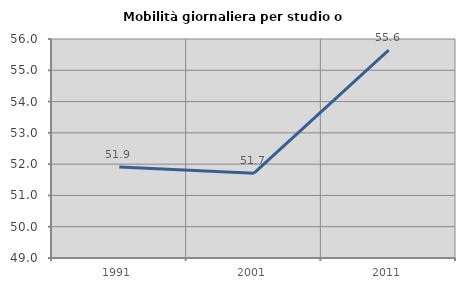
| Category | Mobilità giornaliera per studio o lavoro |
|---|---|
| 1991.0 | 51.913 |
| 2001.0 | 51.712 |
| 2011.0 | 55.647 |